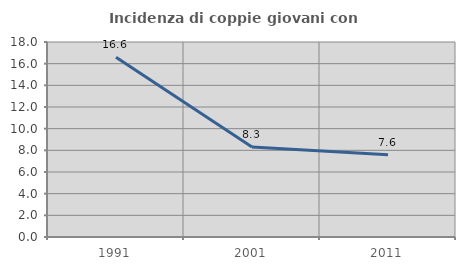
| Category | Incidenza di coppie giovani con figli |
|---|---|
| 1991.0 | 16.594 |
| 2001.0 | 8.3 |
| 2011.0 | 7.6 |